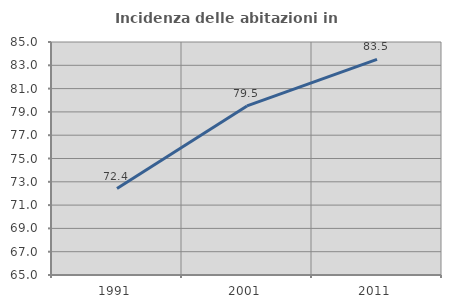
| Category | Incidenza delle abitazioni in proprietà  |
|---|---|
| 1991.0 | 72.421 |
| 2001.0 | 79.515 |
| 2011.0 | 83.51 |